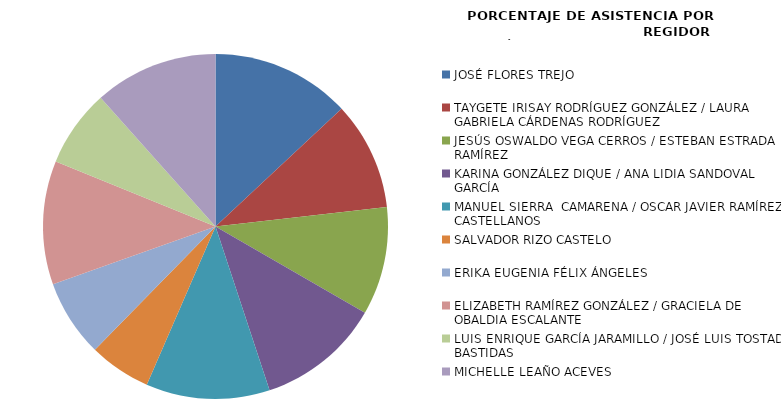
| Category | Series 0 |
|---|---|
| JOSÉ FLORES TREJO | 100 |
| TAYGETE IRISAY RODRÍGUEZ GONZÁLEZ / LAURA GABRIELA CÁRDENAS RODRÍGUEZ | 77.778 |
| JESÚS OSWALDO VEGA CERROS / ESTEBAN ESTRADA RAMÍREZ | 77.778 |
| KARINA GONZÁLEZ DIQUE / ANA LIDIA SANDOVAL GARCÍA | 88.889 |
| MANUEL SIERRA  CAMARENA / OSCAR JAVIER RAMÍREZ CASTELLANOS | 88.889 |
| SALVADOR RIZO CASTELO | 44.444 |
| ERIKA EUGENIA FÉLIX ÁNGELES  | 55.556 |
| ELIZABETH RAMÍREZ GONZÁLEZ / GRACIELA DE OBALDIA ESCALANTE | 88.889 |
| LUIS ENRIQUE GARCÍA JARAMILLO / JOSÉ LUIS TOSTADO BASTIDAS | 55.556 |
| MICHELLE LEAÑO ACEVES | 88.889 |